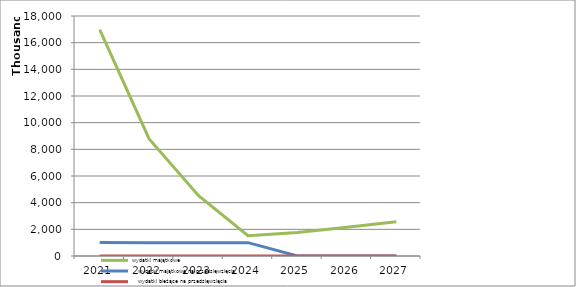
| Category | wydatki majątkowe |    wydatki majątkowe na przedsięwzięcia |    wydatki bieżące na przedsięwzięcia |
|---|---|---|---|
| 2021.0 | 16978022 | 1010000 | 0 |
| 2022.0 | 8785193 | 1000000 | 0 |
| 2023.0 | 4524441 | 1000000 | 0 |
| 2024.0 | 1519167 | 1000000 | 0 |
| 2025.0 | 1758958 | 0 | 0 |
| 2026.0 | 2151208 | 0 | 0 |
| 2027.0 | 2562900 | 0 | 0 |